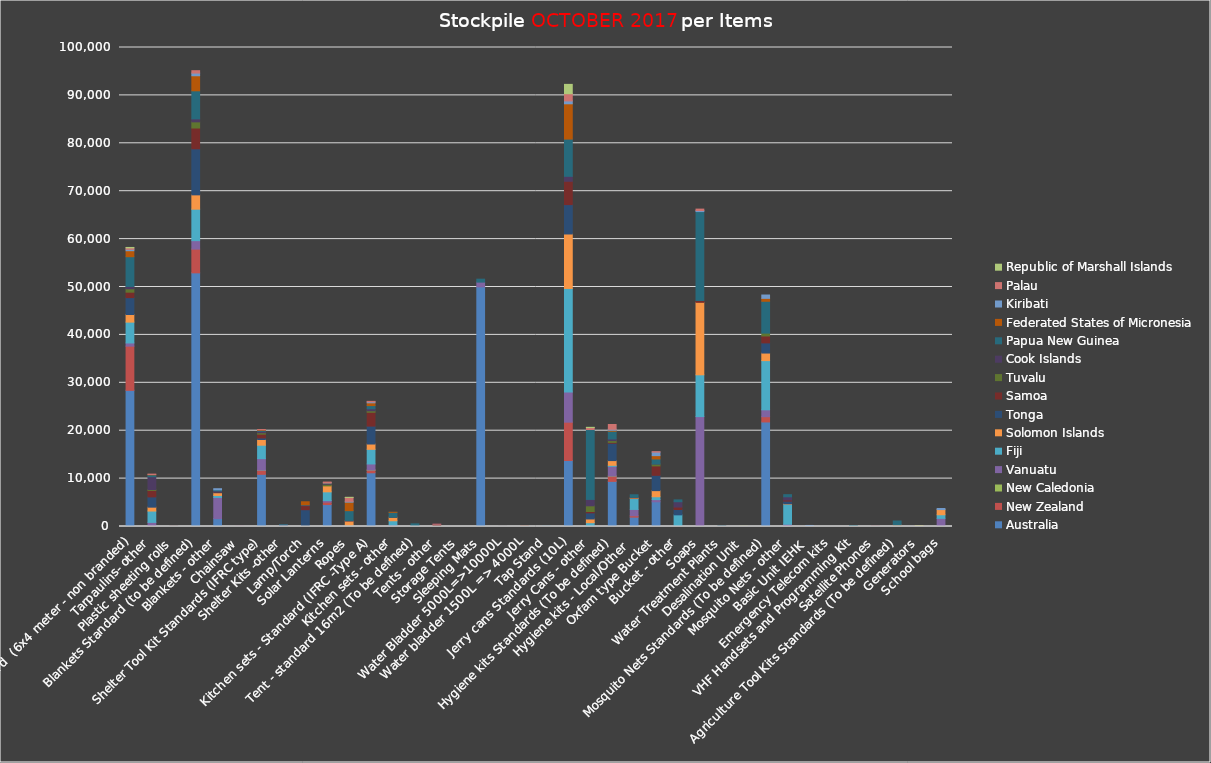
| Category | Australia | New Zealand | New Caledonia | Vanuatu | Fiji | Solomon Islands | Tonga | Samoa | Tuvalu | Cook Islands | Papua New Guinea | Federated States of Micronesia | Kiribati | Palau | Republic of Marshall Islands |
|---|---|---|---|---|---|---|---|---|---|---|---|---|---|---|---|
| Tarpaulins Standard  (6x4 meter - non branded) | 28419 | 9234 | 0 | 663 | 4349 | 1588 | 3529 | 1140 | 703 | 494 | 6206 | 1253 | 293 | 300 | 85 |
| Tarpaulins- other | 0 | 0 | 0 | 860 | 2365 | 812 | 2142 | 1345 | 185 | 2688 | 392 | 70 | 0 | 75 | 0 |
| Plastic sheeting rolls | 0 | 0 | 0 | 6 | 25 | 1 | 6 | 4 | 0 | 0 | 0 | 0 | 0 | 0 | 0 |
| Blankets Standard (to be defined) | 52955 | 4960 | 0 | 1763 | 6568 | 2991 | 9610 | 4345 | 1283 | 628 | 5855 | 3142 | 560 | 500 | 0 |
| Blankets - other | 1650 | 0 | 0 | 4421 | 413 | 568 | 145 | 100 | 0 | 134 | 232 | 0 | 229 | 0 | 0 |
| Chainsaw | 0 | 20 | 0 | 3 | 0 | 0 | 0 | 0 | 0 | 0 | 0 | 0 | 0 | 0 | 0 |
| Shelter Tool Kit Standards (IFRC type) | 10891 | 806 | 51 | 2424 | 2802 | 1192 | 324 | 790 | 295 | 313 | 200 | 98 | 0 | 50 | 0 |
| Shelter Kits -other | 0 | 200 | 0 | 90 | 0 | 0 | 0 | 0 | 0 | 0 | 68 | 0 | 0 | 0 | 0 |
| Lamp/Torch | 0 | 0 | 0 | 0 | 120 | 0 | 3384 | 832 | 0 | 119 | 79 | 629 | 0 | 0 | 0 |
| Solar Lanterns | 4579 | 504 | 0 | 332 | 1823 | 1244 | 0 | 0 | 333 | 216 | 0 | 50 | 94 | 100 | 0 |
| Ropes | 0 | 0 | 0 | 150 | 120 | 927 | 1 | 11 | 0 | 37 | 2061 | 1777 | 176 | 810 | 15 |
| Kitchen sets - Standard (IFRC -Type A) | 11215 | 560 | 10 | 1273 | 3052 | 1109 | 3739 | 2890 | 315 | 418 | 659 | 584 | 199 | 100 | 0 |
| Kitchen sets - other | 0 | 0 | 0 | 293 | 906 | 711 | 0 | 8 | 0 | 0 | 1035 | 11 | 0 | 0 | 0 |
| Tent - standard 16m2 (To be defined) | 0 | 0 | 0 | 0 | 72 | 0 | 148 | 0 | 0 | 0 | 335 | 0 | 0 | 0 | 0 |
| Tents - other | 0 | 0 | 0 | 20 | 55 | 87 | 0 | 305 | 0 | 1 | 0 | 0 | 0 | 1 | 0 |
| Storage Tents | 0 | 0 | 0 | 5 | 0 | 0 | 0 | 0 | 0 | 0 | 1 | 0 | 0 | 0 | 0 |
| Sleeping Mats | 50023 | 0 | 0 | 994 | 0 | 0 | 0 | 0 | 0 | 0 | 614 | 0 | 0 | 0 | 0 |
| Water Bladder 5000L=>10000L | 9 | 6 | 2 | 6 | 5 | 0 | 0 | 2 | 0 | 0 | 0 | 0 | 0 | 0 | 0 |
| Water bladder 1500L => 4000L | 17 | 4 | 10 | 12 | 5 | 10 | 0 | 2 | 0 | 0 | 0 | 0 | 0 | 0 | 0 |
| Tap Stand | 8 | 6 | 10 | 12 | 5 | 0 | 0 | 0 | 0 | 0 | 0 | 0 | 0 | 0 | 0 |
| Jerry cans Standards (10L) | 13778 | 8000 | 0 | 6308 | 21612 | 11368 | 6133 | 4873 | 0 | 1036 | 7776 | 7366 | 600 | 1500 | 1950 |
| Jerry Cans - other | 0 | 0 | 0 | 198 | 600 | 776 | 1270 | 289 | 1185 | 1341 | 14584 | 0 | 0 | 414 | 46 |
| Hygiene kits Standards (To be defined) | 9417 | 1100 | 19 | 2026 | 207 | 990 | 3621 | 186 | 366 | 345 | 1608 | 196 | 216 | 1000 | 0 |
| Hygiene kits - Local/Other  | 1950 | 300 | 0 | 1317 | 2304 | 100 | 0 | 100 | 0 | 0 | 551 | 0 | 0 | 0 | 0 |
| Oxfam type Bucket | 5157 | 0 | 0 | 458 | 600 | 1273 | 3195 | 1971 | 395 | 14 | 1041 | 692 | 730 | 100 | 0 |
| Bucket - other | 0 | 0 | 0 | 218 | 2214 | 0 | 1112 | 520 | 0 | 1112 | 376 | 0 | 0 | 0 | 0 |
| Soaps | 0 | 0 | 0 | 22947 | 8720 | 15134 | 0 | 392 | 0 | 0 | 18558 | 0 | 206 | 304 | 0 |
| Water Treatment Plants | 2 | 0 | 0 | 2 | 120 | 7 | 0 | 0 | 0 | 1 | 1 | 0 | 0 | 0 | 0 |
| Desalination Unit | 0 | 4 | 0 | 0 | 0 | 0 | 0 | 0 | 0 | 2 | 0 | 5 | 0 | 0 | 28 |
| Mosquito Nets Standards (To be defined) | 21823 | 1100 | 0 | 1436 | 10272 | 1580 | 2117 | 1452 | 592 | 0 | 6648 | 608 | 698 | 0 | 0 |
| Mosquito Nets - other | 0 | 0 | 0 | 470 | 4195 | 73 | 556 | 260 | 0 | 651 | 439 | 0 | 0 | 0 | 0 |
| Basic Unit IEHK  | 0 | 0 | 0 | 0 | 14 | 200 | 0 | 0 | 0 | 0 | 0 | 0 | 2 | 0 | 0 |
| Emergency Telecom kits | 0 | 0 | 0 | 0 | 0 | 0 | 0 | 0 | 0 | 0 | 0 | 0 | 0 | 1 | 0 |
| VHF Handsets and Programming Kit | 0 | 14 | 30 | 8 | 0 | 0 | 0 | 28 | 0 | 2 | 113 | 0 | 0 | 0 | 0 |
| Satellite Phones | 2 | 5 | 2 | 10 | 3 | 6 | 0 | 0 | 0 | 11 | 23 | 0 | 0 | 6 | 0 |
| Agriculture Tool Kits Standards (To be defined) | 0 | 200 | 0 | 0 | 0 | 90 | 0 | 0 | 0 | 0 | 856 | 0 | 0 | 0 | 0 |
| Generators | 41 | 20 | 4 | 12 | 1 | 0 | 0 | 0 | 0 | 0 | 0 | 3 | 0 | 34 | 32 |
| School bags | 0 | 0 | 0 | 1702 | 750 | 1080 | 0 | 0 | 0 | 0 | 0 | 0 | 229 | 0 | 0 |